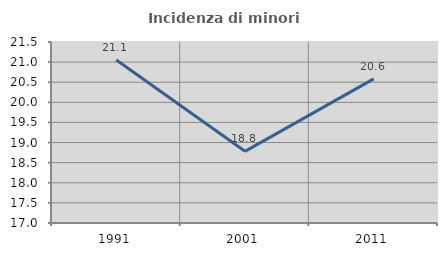
| Category | Incidenza di minori stranieri |
|---|---|
| 1991.0 | 21.053 |
| 2001.0 | 18.782 |
| 2011.0 | 20.583 |